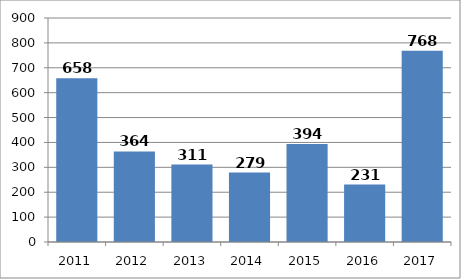
| Category | Series 0 |
|---|---|
| 2011.0 | 658 |
| 2012.0 | 364 |
| 2013.0 | 311 |
| 2014.0 | 279 |
| 2015.0 | 394 |
| 2016.0 | 231 |
| 2017.0 | 768 |